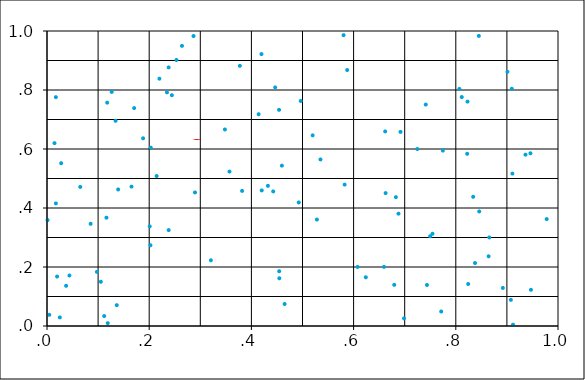
| Category | Series 0 |
|---|---|
| 0.214613011291543 | 0.508 |
| 0.807065107301604 | 0.804 |
| 0.459666450282993 | 0.543 |
| 0.496445751006924 | 0.763 |
| 0.659513552170086 | 0.2 |
| 0.202461293028092 | 0.274 |
| 0.587377082739036 | 0.868 |
| 0.892059299001071 | 0.129 |
| 0.419660577503173 | 0.922 |
| 0.238169506429947 | 0.325 |
| 0.00107329966283642 | 0.359 |
| 0.381784503147974 | 0.458 |
| 0.947111109916451 | 0.123 |
| 0.420234524415084 | 0.46 |
| 0.741243449691837 | 0.751 |
| 0.165361765302943 | 0.473 |
| 0.116325704282132 | 0.367 |
| 0.698624462099171 | 0.026 |
| 0.0197364036422212 | 0.168 |
| 0.822939925111557 | 0.761 |
| 0.519898569904481 | 0.646 |
| 0.662628618022574 | 0.451 |
| 0.528239251207809 | 0.361 |
| 0.188041715223299 | 0.636 |
| 0.200990859636975 | 0.338 |
| 0.0276951013178179 | 0.552 |
| 0.286754570189773 | 0.983 |
| 0.910747236782526 | 0.517 |
| 0.465049884058864 | 0.075 |
| 0.4465383460795 | 0.809 |
| 0.442690050730765 | 0.456 |
| 0.582534326186484 | 0.479 |
| 0.724639847994238 | 0.6 |
| 0.0146936527062013 | 0.62 |
| 0.911947006958348 | 0.004 |
| 0.691811710147327 | 0.658 |
| 0.811674937470251 | 0.776 |
| 0.743618185569427 | 0.139 |
| 0.00441811796653413 | 0.038 |
| 0.348159391579045 | 0.666 |
| 0.865529556485041 | 0.3 |
| 0.219964179404399 | 0.838 |
| 0.909538625601671 | 0.804 |
| 0.837644307354647 | 0.213 |
| 0.833978325559775 | 0.438 |
| 0.11192987460967 | 0.034 |
| 0.77467024406154 | 0.595 |
| 0.8223145656988 | 0.584 |
| 0.432325581736769 | 0.475 |
| 0.414124266197749 | 0.718 |
| 0.289602192501917 | 0.453 |
| 0.377401172662563 | 0.882 |
| 0.580356215151218 | 0.986 |
| 0.238043719398131 | 0.877 |
| 0.661799751244552 | 0.66 |
| 0.126651728527764 | 0.793 |
| 0.977870556266417 | 0.362 |
| 0.244347415731605 | 0.782 |
| 0.253319075836121 | 0.902 |
| 0.864234741776049 | 0.236 |
| 0.946086551545129 | 0.585 |
| 0.90776236688833 | 0.089 |
| 0.535192716236019 | 0.565 |
| 0.0373646857803534 | 0.136 |
| 0.454372531615515 | 0.186 |
| 0.118893581118852 | 0.01 |
| 0.0173792530558264 | 0.416 |
| 0.264145607263491 | 0.95 |
| 0.0854059149252632 | 0.346 |
| 0.136483626223 | 0.071 |
| 0.93635463305198 | 0.581 |
| 0.492670426242778 | 0.419 |
| 0.134217056542272 | 0.696 |
| 0.234770986436676 | 0.792 |
| 0.203048884575223 | 0.605 |
| 0.901033254217536 | 0.862 |
| 0.824189053817355 | 0.142 |
| 0.754370008141377 | 0.313 |
| 0.357109361169869 | 0.523 |
| 0.607726940950763 | 0.2 |
| 0.0975902010968378 | 0.184 |
| 0.845032671071067 | 0.983 |
| 0.687834895984181 | 0.381 |
| 0.0250680306679627 | 0.029 |
| 0.771421575879452 | 0.049 |
| 0.454626042203635 | 0.162 |
| 0.139211761410481 | 0.463 |
| 0.0650735026151173 | 0.471 |
| 0.117771457004967 | 0.757 |
| 0.679510170334792 | 0.139 |
| 0.623861889496198 | 0.165 |
| 0.682775165032014 | 0.437 |
| 0.845829256110732 | 0.388 |
| 0.0438578817606666 | 0.171 |
| 0.454098329945577 | 0.733 |
| 0.170513671663062 | 0.739 |
| 0.320718910393786 | 0.223 |
| 0.749723485001556 | 0.304 |
| 0.0173378727642393 | 0.776 |
| 0.105277176748868 | 0.15 |